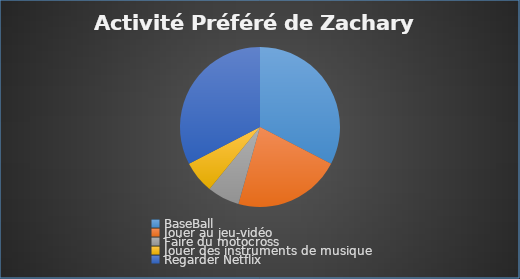
| Category | Series 0 |
|---|---|
| BaseBall | 15 |
| Jouer au jeu-vidéo | 10 |
| Faire du motocross | 3 |
| Jouer des instruments de musique  | 3 |
| Regarder Netflix | 15 |